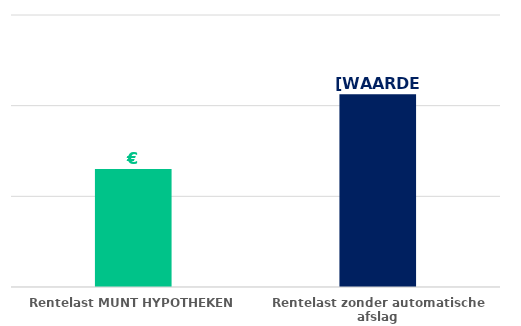
| Category | Series 0 |
|---|---|
| Rentelast MUNT HYPOTHEKEN | 83007.449 |
| Rentelast zonder automatische afslag | 91270.903 |